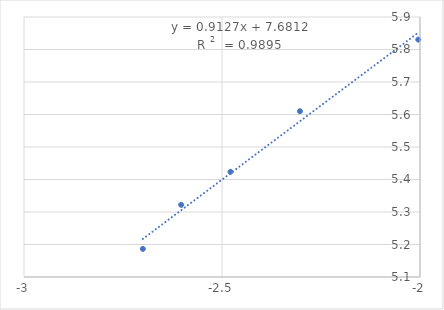
| Category | Series 0 |
|---|---|
| -2.0043213737826426 | 5.831 |
| -2.303196057420489 | 5.61 |
| -2.4785664955938436 | 5.424 |
| -2.603144372620182 | 5.322 |
| -2.699837725867246 | 5.186 |